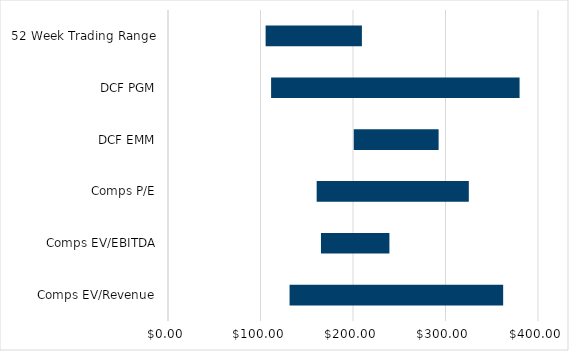
| Category | Min | Difference | Max |
|---|---|---|---|
| Comps EV/Revenue | 131.42 | 230.92 | 362.34 |
| Comps EV/EBITDA | 165.36 | 74.01 | 239.37 |
| Comps P/E | 160.72 | 164.48 | 325.2 |
| DCF EMM | 200.83 | 91.73 | 292.56 |
| DCF PGM | 111.46 | 268.62 | 380.08 |
| 52 Week Trading Range | 105.54 | 104.08 | 209.62 |